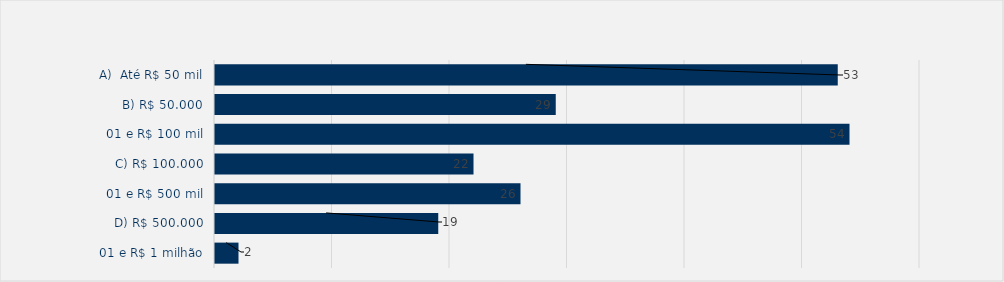
| Category | Total |
|---|---|
| A)  Até R$ 50 mil | 53 |
| B) R$ 50.000,01 e R$ 100 mil | 29 |
| C) R$ 100.000,01 e R$ 500 mil | 54 |
| D) R$ 500.000,01 e R$ 1 milhão | 22 |
| E) R$ 1.000.000,01 e R$ 5 milhões | 26 |
| F)  Superior a R$ 5 milhões | 19 |
| Sem valor autorizado | 2 |